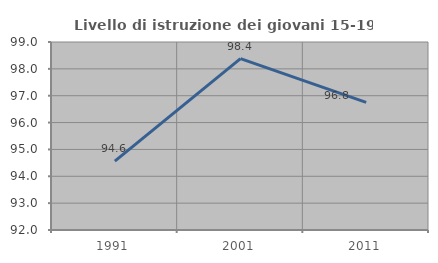
| Category | Livello di istruzione dei giovani 15-19 anni |
|---|---|
| 1991.0 | 94.565 |
| 2001.0 | 98.378 |
| 2011.0 | 96.753 |